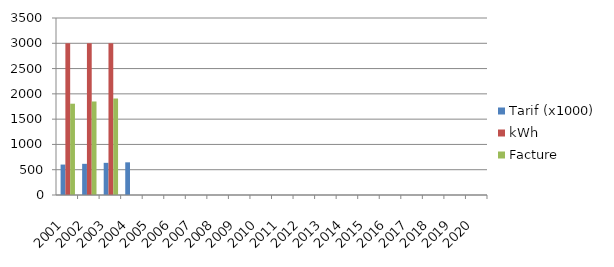
| Category | Tarif (x1000) | kWh | Facture |
|---|---|---|---|
| 2001-02-17 | 601.76 | 3000 | 1805.28 |
| 2002-02-17 | 616.39 | 3000 | 1849.17 |
| 2003-02-17 | 636.05 | 3000 | 1908.15 |
| 2004-02-17 | 646.07 | 0 | 0 |
| 2005-02-17 | 0 | 0 | 0 |
| 2006-02-17 | 0 | 0 | 0 |
| 2007-02-17 | 0 | 0 | 0 |
| 2008-02-17 | 0 | 0 | 0 |
| 2009-02-17 | 0 | 0 | 0 |
| 2010-02-17 | 0 | 0 | 0 |
| 2011-02-17 | 0 | 0 | 0 |
| 2012-02-17 | 0 | 0 | 0 |
| 2013-02-17 | 0 | 0 | 0 |
| 2014-02-17 | 0 | 0 | 0 |
| 2015-02-17 | 0 | 0 | 0 |
| 2016-02-17 | 0 | 0 | 0 |
| 2017-02-17 | 0 | 0 | 0 |
| 2018-02-17 | 0 | 0 | 0 |
| 2019-02-17 | 0 | 0 | 0 |
| 2020-02-17 | 0 | 0 | 0 |